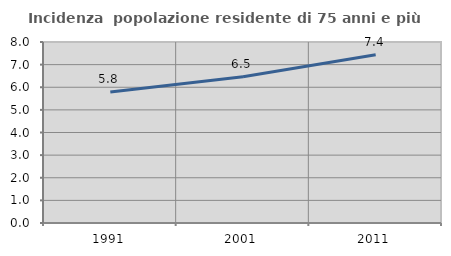
| Category | Incidenza  popolazione residente di 75 anni e più |
|---|---|
| 1991.0 | 5.786 |
| 2001.0 | 6.465 |
| 2011.0 | 7.433 |